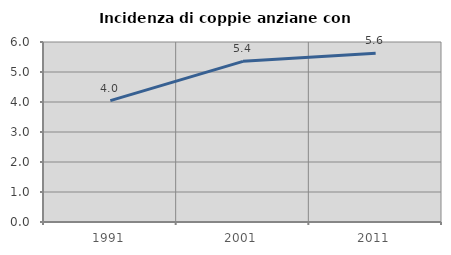
| Category | Incidenza di coppie anziane con figli |
|---|---|
| 1991.0 | 4.045 |
| 2001.0 | 5.355 |
| 2011.0 | 5.629 |